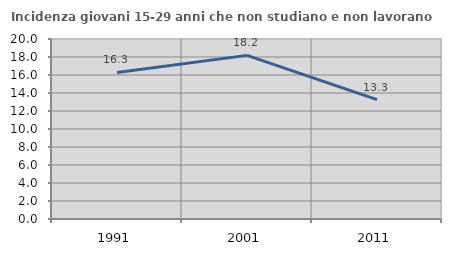
| Category | Incidenza giovani 15-29 anni che non studiano e non lavorano  |
|---|---|
| 1991.0 | 16.279 |
| 2001.0 | 18.182 |
| 2011.0 | 13.265 |